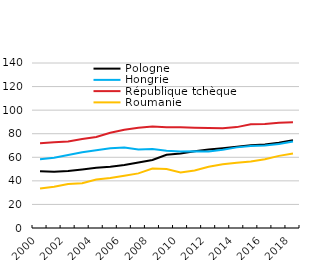
| Category | Pologne | Hongrie | République tchèque | Roumanie |
|---|---|---|---|---|
| 2000.0 | 48.158 | 58.345 | 71.873 | 33.554 |
| 2001.0 | 47.78 | 59.583 | 72.73 | 35.085 |
| 2002.0 | 48.281 | 61.948 | 73.319 | 37.265 |
| 2003.0 | 49.678 | 64.203 | 75.442 | 37.974 |
| 2004.0 | 51.048 | 65.885 | 77.286 | 41.075 |
| 2005.0 | 51.98 | 67.68 | 80.862 | 42.379 |
| 2006.0 | 53.466 | 68.272 | 83.425 | 44.422 |
| 2007.0 | 55.611 | 66.574 | 85.07 | 46.343 |
| 2008.0 | 57.692 | 67.077 | 86.22 | 50.497 |
| 2009.0 | 62.188 | 65.63 | 85.454 | 50.034 |
| 2010.0 | 63.183 | 64.876 | 85.379 | 47.183 |
| 2011.0 | 65.03 | 65.049 | 85.043 | 48.77 |
| 2012.0 | 66.576 | 64.824 | 84.879 | 51.906 |
| 2013.0 | 67.71 | 66.431 | 84.635 | 54.054 |
| 2014.0 | 69.018 | 68.413 | 85.6 | 55.311 |
| 2015.0 | 70.121 | 69.63 | 87.968 | 56.435 |
| 2016.0 | 70.926 | 70.014 | 88.24 | 58.359 |
| 2017.0 | 72.436 | 71.284 | 89.389 | 61.195 |
| 2018.0 | 74.553 | 73.423 | 89.697 | 63.173 |